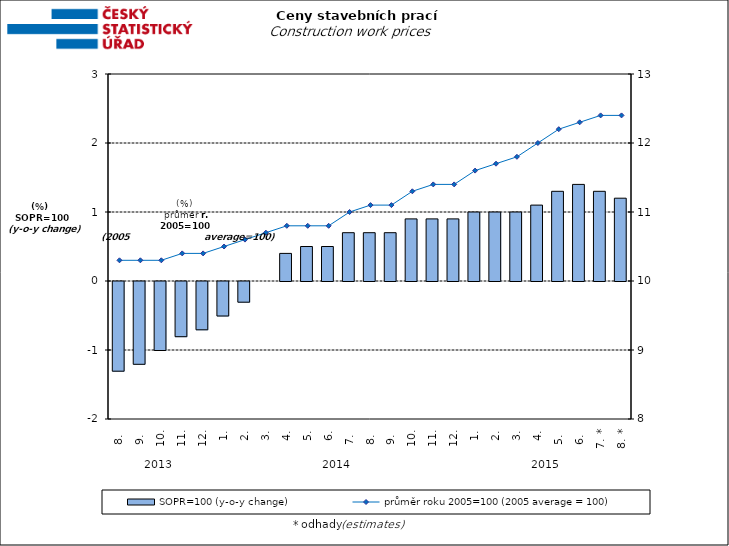
| Category | SOPR=100 (y-o-y change)   |
|---|---|
| 0 | -1.3 |
| 1 | -1.2 |
| 2 | -1 |
| 3 | -0.8 |
| 4 | -0.7 |
| 5 | -0.5 |
| 6 | -0.3 |
| 7 | 0 |
| 8 | 0.4 |
| 9 | 0.5 |
| 10 | 0.5 |
| 11 | 0.7 |
| 12 | 0.7 |
| 13 | 0.7 |
| 14 | 0.9 |
| 15 | 0.9 |
| 16 | 0.9 |
| 17 | 1 |
| 18 | 1 |
| 19 | 1 |
| 20 | 1.1 |
| 21 | 1.3 |
| 22 | 1.4 |
| 23 | 1.3 |
| 24 | 1.2 |